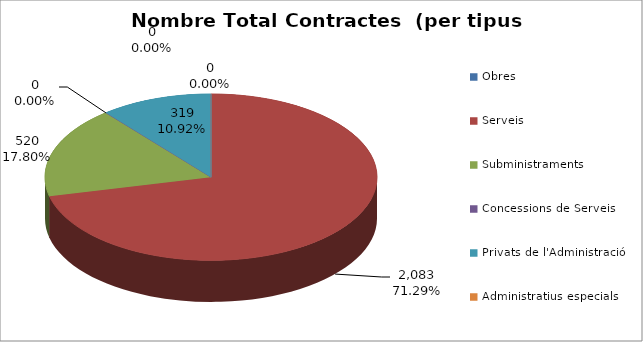
| Category | Nombre Total Contractes |
|---|---|
| Obres | 0 |
| Serveis | 2083 |
| Subministraments | 520 |
| Concessions de Serveis | 0 |
| Privats de l'Administració | 319 |
| Administratius especials | 0 |